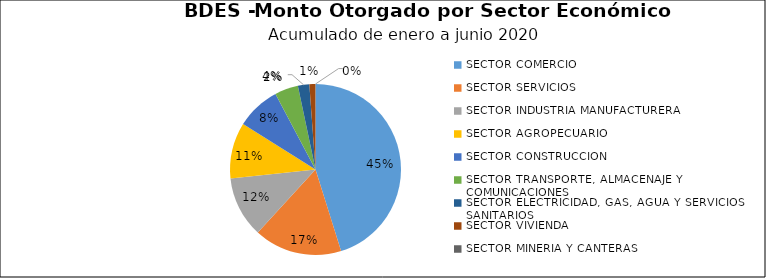
| Category | Monto | Créditos |
|---|---|---|
| SECTOR COMERCIO | 44.753 | 3364 |
| SECTOR SERVICIOS | 16.474 | 290 |
| SECTOR INDUSTRIA MANUFACTURERA | 11.425 | 142 |
| SECTOR AGROPECUARIO | 10.497 | 369 |
| SECTOR CONSTRUCCION | 8.254 | 260 |
| SECTOR TRANSPORTE, ALMACENAJE Y COMUNICACIONES | 4.403 | 225 |
| SECTOR ELECTRICIDAD, GAS, AGUA Y SERVICIOS SANITARIOS | 2.142 | 5 |
| SECTOR VIVIENDA | 1.129 | 27 |
| SECTOR MINERIA Y CANTERAS | 0.007 | 2 |